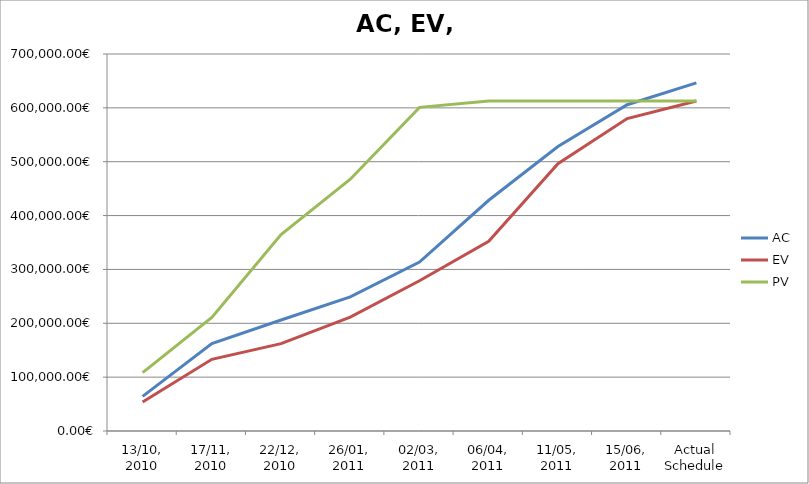
| Category | AC | EV | PV |
|---|---|---|---|
| 13/10, 2010 | 64229.975 | 53943.439 | 108303.438 |
| 17/11, 2010 | 162225.926 | 133050.344 | 210788.29 |
| 22/12, 2010 | 206085.824 | 162127.239 | 364851.592 |
| 26/01, 2011 | 249017.905 | 211403.24 | 467509.75 |
| 02/03, 2011 | 313663.205 | 278874.44 | 600900.46 |
| 06/04, 2011 | 428397.027 | 352367.242 | 612769.44 |
| 11/05, 2011 | 528318.215 | 496257.989 | 612769.44 |
| 15/06, 2011 | 605852.885 | 580197.449 | 612769.44 |
| Actual Schedule | 646473.646 | 612769.44 | 612769.44 |